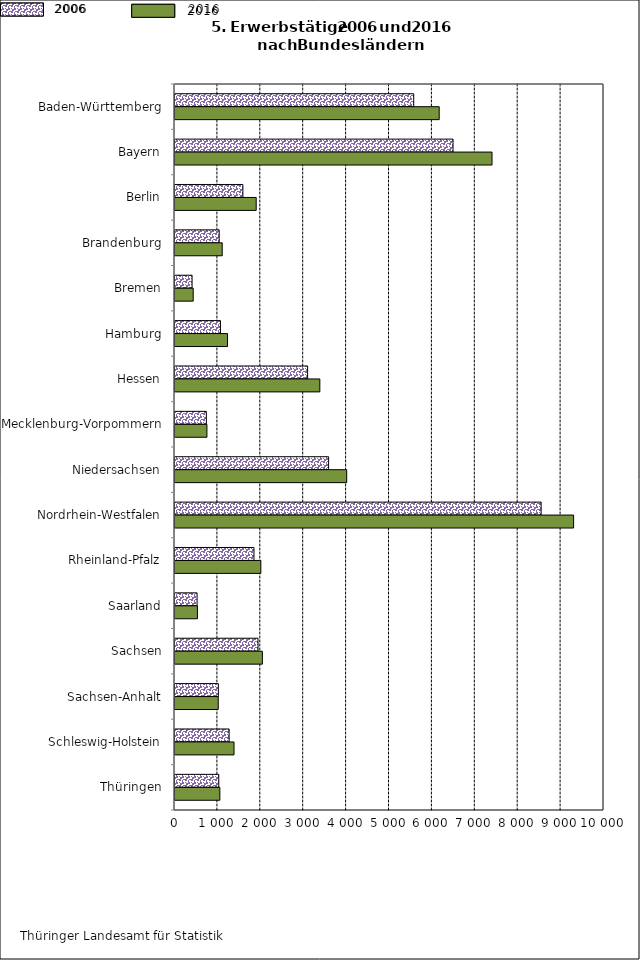
| Category | Series 3 | Series 4 |
|---|---|---|
| Baden-Württemberg | 5564.523 | 6158.588 |
| Bayern | 6480.981 | 7389.779 |
| Berlin | 1582.466 | 1892.546 |
| Brandenburg | 1029.773 | 1100.504 |
| Bremen | 397.878 | 424.348 |
| Hamburg | 1059.697 | 1224.305 |
| Hessen | 3091.395 | 3376.048 |
| Mecklenburg-Vorpommern | 730.763 | 744.204 |
| Niedersachsen | 3580.439 | 4002.482 |
| Nordrhein-Westfalen | 8534.825 | 9291.775 |
| Rheinland-Pfalz | 1840.567 | 2000.78 |
| Saarland | 514.399 | 523.163 |
| Sachsen | 1934.988 | 2037.381 |
| Sachsen-Anhalt | 1010.397 | 1007.938 |
| Schleswig-Holstein | 1261.692 | 1375.757 |
| Thüringen | 1020.217 | 1045.402 |